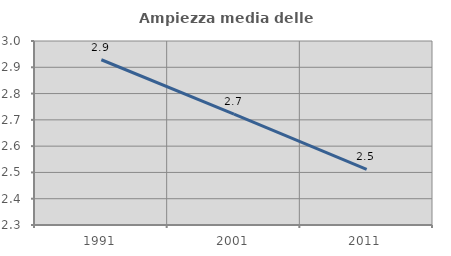
| Category | Ampiezza media delle famiglie |
|---|---|
| 1991.0 | 2.929 |
| 2001.0 | 2.722 |
| 2011.0 | 2.512 |